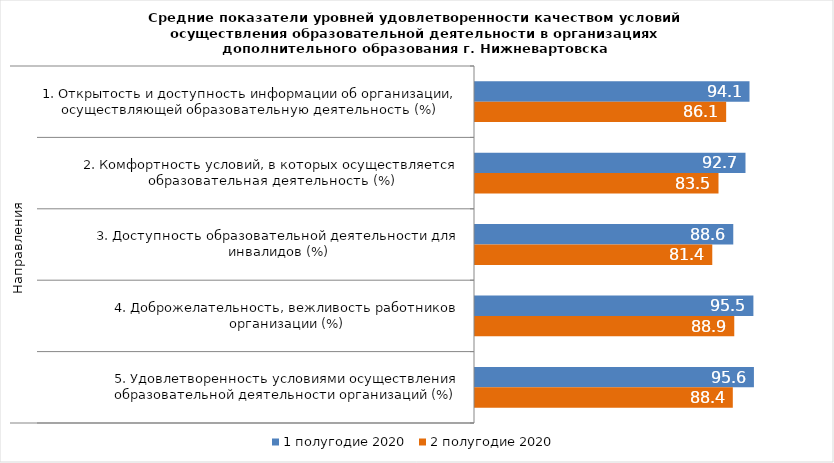
| Category | 1 полугодие 2020 | 2 полугодие 2020 |
|---|---|---|
| 0 | 94.115 | 86.11 |
| 1 | 92.74 | 83.485 |
| 2 | 88.55 | 81.35 |
| 3 | 95.45 | 88.89 |
| 4 | 95.63 | 88.39 |